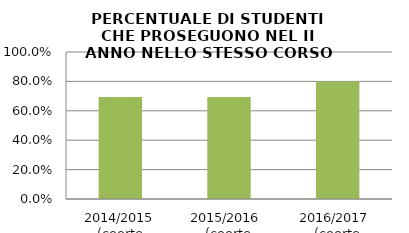
| Category | 2014/2015 (coorte 2013/14) 2015/2016  (coorte 2014/15) 2016/2017  (coorte 2015/16) |
|---|---|
| 2014/2015 (coorte 2013/14) | 0.694 |
| 2015/2016  (coorte 2014/15) | 0.693 |
| 2016/2017  (coorte 2015/16) | 0.8 |